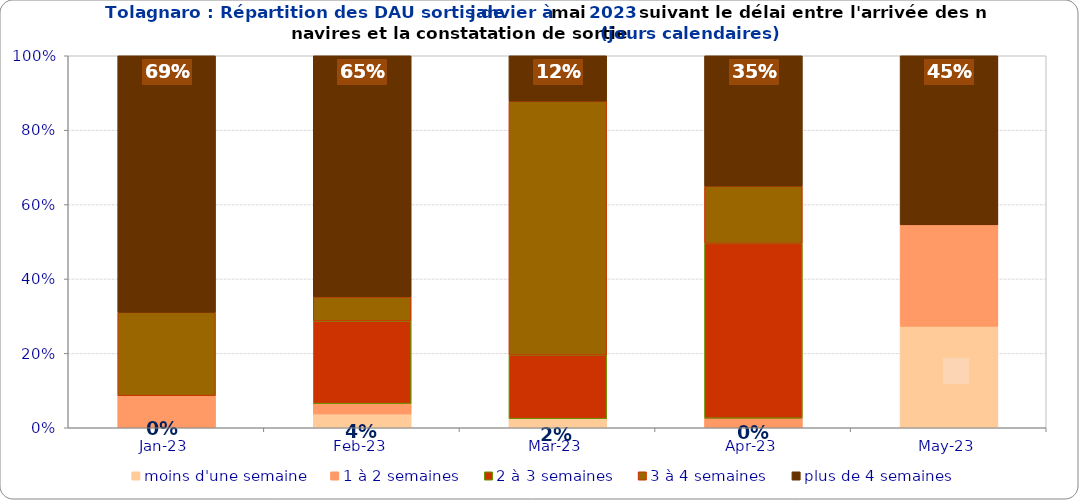
| Category | moins d'une semaine | 1 à 2 semaines | 2 à 3 semaines | 3 à 4 semaines | plus de 4 semaines |
|---|---|---|---|---|---|
| 2023-01-01 | 0 | 0.086 | 0 | 0.224 | 0.69 |
| 2023-02-01 | 0.037 | 0.028 | 0.222 | 0.065 | 0.648 |
| 2023-03-01 | 0.024 | 0 | 0.171 | 0.683 | 0.122 |
| 2023-04-01 | 0 | 0.026 | 0.47 | 0.154 | 0.35 |
| 2023-05-01 | 0.273 | 0.273 | 0 | 0 | 0.455 |